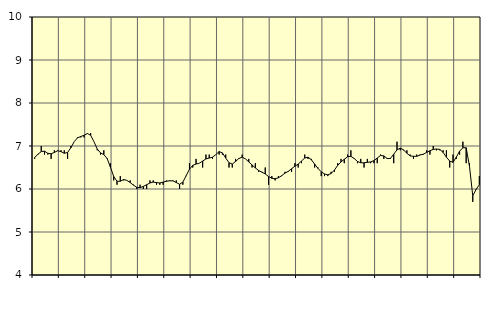
| Category | Piggar | Transport, SNI 49-53 |
|---|---|---|
| nan | 6.7 | 6.73 |
| 87.0 | 6.8 | 6.81 |
| 87.0 | 7 | 6.87 |
| 87.0 | 6.8 | 6.88 |
| nan | 6.8 | 6.83 |
| 88.0 | 6.7 | 6.82 |
| 88.0 | 6.9 | 6.85 |
| 88.0 | 6.9 | 6.89 |
| nan | 6.9 | 6.87 |
| 89.0 | 6.9 | 6.83 |
| 89.0 | 6.7 | 6.85 |
| 89.0 | 7 | 6.96 |
| nan | 7.1 | 7.1 |
| 90.0 | 7.2 | 7.19 |
| 90.0 | 7.2 | 7.22 |
| 90.0 | 7.2 | 7.25 |
| nan | 7.3 | 7.29 |
| 91.0 | 7.3 | 7.25 |
| 91.0 | 7.1 | 7.1 |
| 91.0 | 6.9 | 6.93 |
| nan | 6.8 | 6.84 |
| 92.0 | 6.9 | 6.8 |
| 92.0 | 6.7 | 6.71 |
| 92.0 | 6.6 | 6.51 |
| nan | 6.2 | 6.29 |
| 93.0 | 6.1 | 6.18 |
| 93.0 | 6.3 | 6.18 |
| 93.0 | 6.2 | 6.22 |
| nan | 6.2 | 6.2 |
| 94.0 | 6.2 | 6.15 |
| 94.0 | 6.1 | 6.09 |
| 94.0 | 6 | 6.04 |
| nan | 6.1 | 6.03 |
| 95.0 | 6 | 6.06 |
| 95.0 | 6 | 6.1 |
| 95.0 | 6.2 | 6.14 |
| nan | 6.2 | 6.16 |
| 96.0 | 6.1 | 6.15 |
| 96.0 | 6.1 | 6.14 |
| 96.0 | 6.1 | 6.16 |
| nan | 6.2 | 6.18 |
| 97.0 | 6.2 | 6.19 |
| 97.0 | 6.2 | 6.19 |
| 97.0 | 6.2 | 6.15 |
| nan | 6 | 6.11 |
| 98.0 | 6.1 | 6.16 |
| 98.0 | 6.3 | 6.31 |
| 98.0 | 6.6 | 6.46 |
| nan | 6.5 | 6.55 |
| 99.0 | 6.7 | 6.58 |
| 99.0 | 6.6 | 6.6 |
| 99.0 | 6.5 | 6.65 |
| nan | 6.8 | 6.7 |
| 0.0 | 6.8 | 6.72 |
| 0.0 | 6.7 | 6.74 |
| 0.0 | 6.8 | 6.8 |
| nan | 6.8 | 6.87 |
| 1.0 | 6.8 | 6.84 |
| 1.0 | 6.8 | 6.72 |
| 1.0 | 6.5 | 6.61 |
| nan | 6.5 | 6.58 |
| 2.0 | 6.7 | 6.64 |
| 2.0 | 6.7 | 6.71 |
| 2.0 | 6.8 | 6.74 |
| nan | 6.7 | 6.7 |
| 3.0 | 6.7 | 6.63 |
| 3.0 | 6.5 | 6.56 |
| 3.0 | 6.6 | 6.49 |
| nan | 6.4 | 6.43 |
| 4.0 | 6.4 | 6.39 |
| 4.0 | 6.5 | 6.35 |
| 4.0 | 6.1 | 6.29 |
| nan | 6.3 | 6.25 |
| 5.0 | 6.2 | 6.24 |
| 5.0 | 6.3 | 6.26 |
| 5.0 | 6.3 | 6.31 |
| nan | 6.4 | 6.37 |
| 6.0 | 6.4 | 6.41 |
| 6.0 | 6.4 | 6.47 |
| 6.0 | 6.6 | 6.53 |
| nan | 6.5 | 6.58 |
| 7.0 | 6.6 | 6.65 |
| 7.0 | 6.8 | 6.72 |
| 7.0 | 6.7 | 6.74 |
| nan | 6.7 | 6.68 |
| 8.0 | 6.5 | 6.58 |
| 8.0 | 6.5 | 6.48 |
| 8.0 | 6.3 | 6.4 |
| nan | 6.3 | 6.35 |
| 9.0 | 6.3 | 6.33 |
| 9.0 | 6.4 | 6.36 |
| 9.0 | 6.4 | 6.44 |
| nan | 6.6 | 6.55 |
| 10.0 | 6.7 | 6.63 |
| 10.0 | 6.6 | 6.69 |
| 10.0 | 6.8 | 6.75 |
| nan | 6.9 | 6.76 |
| 11.0 | 6.7 | 6.71 |
| 11.0 | 6.6 | 6.64 |
| 11.0 | 6.7 | 6.61 |
| nan | 6.5 | 6.61 |
| 12.0 | 6.7 | 6.62 |
| 12.0 | 6.6 | 6.63 |
| 12.0 | 6.6 | 6.66 |
| nan | 6.6 | 6.72 |
| 13.0 | 6.8 | 6.78 |
| 13.0 | 6.7 | 6.77 |
| 13.0 | 6.7 | 6.71 |
| nan | 6.7 | 6.71 |
| 14.0 | 6.6 | 6.81 |
| 14.0 | 7.1 | 6.91 |
| 14.0 | 6.9 | 6.95 |
| nan | 6.9 | 6.91 |
| 15.0 | 6.9 | 6.83 |
| 15.0 | 6.8 | 6.77 |
| 15.0 | 6.7 | 6.76 |
| nan | 6.8 | 6.76 |
| 16.0 | 6.8 | 6.79 |
| 16.0 | 6.8 | 6.81 |
| 16.0 | 6.9 | 6.85 |
| nan | 6.8 | 6.89 |
| 17.0 | 7 | 6.92 |
| 17.0 | 6.9 | 6.93 |
| 17.0 | 6.9 | 6.92 |
| nan | 6.9 | 6.85 |
| 18.0 | 6.9 | 6.74 |
| 18.0 | 6.5 | 6.65 |
| 18.0 | 6.8 | 6.62 |
| nan | 6.7 | 6.74 |
| 19.0 | 6.8 | 6.88 |
| 19.0 | 7.1 | 6.96 |
| 19.0 | 6.6 | 6.96 |
| nan | 6.6 | 6.53 |
| 20.0 | 5.7 | 5.84 |
| 20.0 | 6 | 5.99 |
| 20.0 | 6.3 | 6.1 |